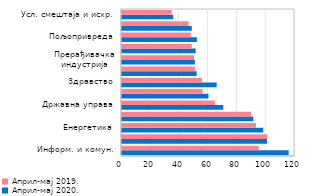
| Category | Април-мај 2020. | Април-мај 2019. |
|---|---|---|
| Информ. и комун. | 115.589 | 94.858 |
| Финансијски сектор | 100.623 | 100.64 |
| Енергетика | 97.976 | 92.976 |
| Рударство | 91.106 | 89.483 |
| Државна управа | 70.266 | 64.425 |
| Образовање | 59.947 | 55.923 |
| Здравство | 65.658 | 55.423 |
| Саобраћај и складиштење | 51.777 | 50.574 |
| Прерађивачка индустрија | 50.515 | 49.927 |
| Грађевинарство | 51.051 | 48.385 |
| Пољопривреда | 51.912 | 47.652 |
| Трговина | 48.387 | 46.171 |
| Усл. смештаја и исхр. | 35.551 | 34.477 |